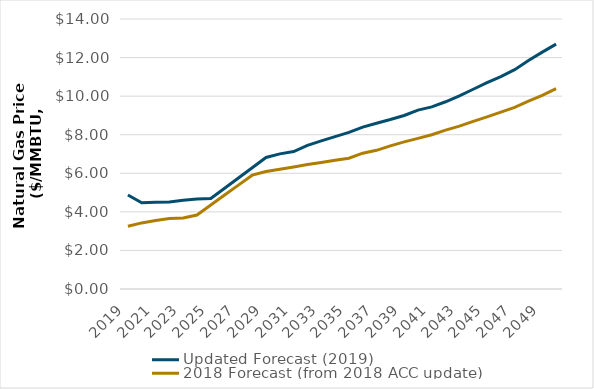
| Category | Updated Forecast (2019) | 2018 Forecast (from 2018 ACC update) |
|---|---|---|
| 2019.0 | 4.876 | 3.251 |
| 2020.0 | 4.467 | 3.427 |
| 2021.0 | 4.495 | 3.553 |
| 2022.0 | 4.508 | 3.653 |
| 2023.0 | 4.597 | 3.679 |
| 2024.0 | 4.664 | 3.837 |
| 2025.0 | 4.697 | 4.353 |
| 2026.0 | 5.227 | 4.87 |
| 2027.0 | 5.758 | 5.386 |
| 2028.0 | 6.29 | 5.902 |
| 2029.0 | 6.822 | 6.095 |
| 2030.0 | 7.007 | 6.21 |
| 2031.0 | 7.127 | 6.326 |
| 2032.0 | 7.452 | 6.453 |
| 2033.0 | 7.683 | 6.561 |
| 2034.0 | 7.899 | 6.679 |
| 2035.0 | 8.118 | 6.783 |
| 2036.0 | 8.396 | 7.043 |
| 2037.0 | 8.596 | 7.19 |
| 2038.0 | 8.786 | 7.423 |
| 2039.0 | 8.998 | 7.631 |
| 2040.0 | 9.278 | 7.809 |
| 2041.0 | 9.445 | 7.998 |
| 2042.0 | 9.709 | 8.235 |
| 2043.0 | 10.012 | 8.449 |
| 2044.0 | 10.358 | 8.692 |
| 2045.0 | 10.701 | 8.926 |
| 2046.0 | 11.015 | 9.169 |
| 2047.0 | 11.37 | 9.42 |
| 2048.0 | 11.849 | 9.746 |
| 2049.0 | 12.281 | 10.045 |
| 2050.0 | 12.697 | 10.386 |